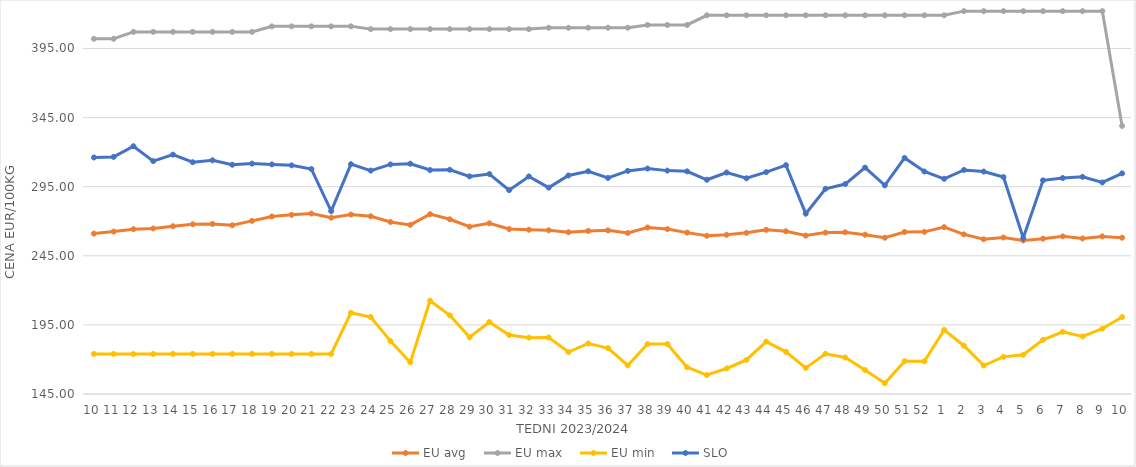
| Category | EU avg | EU max | EU min | SLO |
|---|---|---|---|---|
| 10.0 | 261.06 | 402 | 174 | 316.13 |
| 11.0 | 262.513 | 402 | 174 | 316.55 |
| 12.0 | 264.228 | 407 | 174 | 324.27 |
| 13.0 | 264.768 | 407 | 174 | 313.49 |
| 14.0 | 266.385 | 407 | 174 | 318.17 |
| 15.0 | 267.797 | 407 | 174 | 312.7 |
| 16.0 | 268.021 | 407 | 174 | 314.07 |
| 17.0 | 267.041 | 407 | 174 | 310.87 |
| 18.0 | 270.255 | 407 | 174 | 311.69 |
| 19.0 | 273.406 | 411 | 174 | 311.13 |
| 20.0 | 274.631 | 411 | 174 | 310.42 |
| 21.0 | 275.561 | 411 | 174 | 307.76 |
| 22.0 | 272.542 | 411 | 174 | 277.34 |
| 23.0 | 274.85 | 411 | 203.728 | 311.28 |
| 24.0 | 273.59 | 409 | 200.686 | 306.64 |
| 25.0 | 269.439 | 409 | 183.275 | 311.1 |
| 26.0 | 267.345 | 409 | 167.858 | 311.62 |
| 27.0 | 275.123 | 409 | 212.506 | 307.04 |
| 28.0 | 271.42 | 409 | 201.945 | 307.23 |
| 29.0 | 266.08 | 409 | 186.018 | 302.45 |
| 30.0 | 268.49 | 409 | 197.093 | 304.14 |
| 31.0 | 264.334 | 409 | 187.684 | 292.49 |
| 32.0 | 263.844 | 409 | 185.774 | 302.41 |
| 33.0 | 263.441 | 410 | 185.951 | 294.3 |
| 34.0 | 262.028 | 410 | 175.332 | 303.1 |
| 35.0 | 262.997 | 410 | 181.543 | 306.13 |
| 36.0 | 263.389 | 410 | 178.207 | 301.32 |
| 37.0 | 261.486 | 410 | 165.697 | 306.4 |
| 38.0 | 265.47 | 412 | 181.159 | 308.12 |
| 39.0 | 264.316 | 412 | 181.124 | 306.62 |
| 40.0 | 261.774 | 412 | 164.37 | 306.1 |
| 41.0 | 259.456 | 419 | 158.728 | 300 |
| 42.0 | 260.21 | 419 | 163.464 | 305.24 |
| 43.0 | 261.605 | 419 | 169.66 | 301.07 |
| 44.0 | 263.758 | 419 | 182.925 | 305.52 |
| 45.0 | 262.714 | 419 | 175.524 | 310.58 |
| 46.0 | 259.625 | 419 | 163.882 | 275.46 |
| 47.0 | 261.772 | 419 | 174.136 | 293.51 |
| 48.0 | 262.018 | 419 | 171.4 | 296.9 |
| 49.0 | 260.246 | 419 | 162.336 | 308.8 |
| 50.0 | 258.042 | 419 | 152.762 | 295.97 |
| 51.0 | 262.231 | 419 | 168.739 | 315.82 |
| 52.0 | 262.325 | 419 | 168.659 | 305.97 |
| 1.0 | 265.728 | 419 | 191.406 | 300.71 |
| 2.0 | 260.513 | 422 | 179.926 | 307.09 |
| 3.0 | 256.954 | 422 | 165.575 | 305.92 |
| 4.0 | 258.235 | 422 | 171.865 | 301.97 |
| 5.0 | 256.09 | 422 | 173.378 | 257.83 |
| 6.0 | 257.376 | 422 | 184.141 | 299.57 |
| 7.0 | 259.042 | 422 | 190.004 | 301.25 |
| 8.0 | 257.531 | 422 | 186.634 | 302.13 |
| 9.0 | 259.029 | 422 | 192.26 | 298.07 |
| 10.0 | 258.07 | 338.92 | 200.67 | 304.62 |